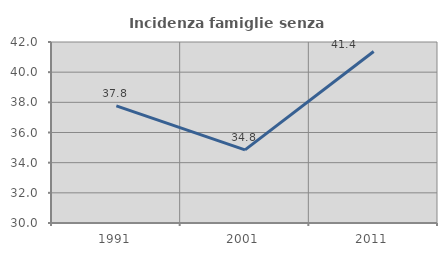
| Category | Incidenza famiglie senza nuclei |
|---|---|
| 1991.0 | 37.76 |
| 2001.0 | 34.844 |
| 2011.0 | 41.369 |